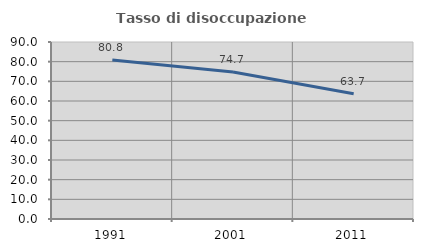
| Category | Tasso di disoccupazione giovanile  |
|---|---|
| 1991.0 | 80.798 |
| 2001.0 | 74.74 |
| 2011.0 | 63.683 |